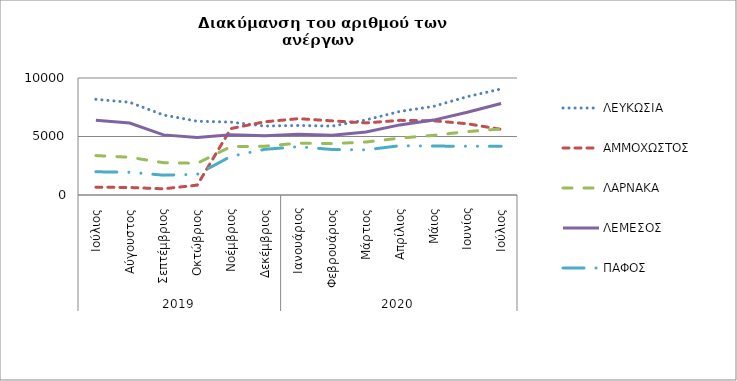
| Category | ΛΕΥΚΩΣΙΑ | ΑΜΜΟΧΩΣΤΟΣ | ΛΑΡΝΑΚΑ | ΛΕΜΕΣΟΣ | ΠΑΦΟΣ |
|---|---|---|---|---|---|
| 0 | 8179 | 668 | 3369 | 6382 | 1984 |
| 1 | 7922 | 641 | 3223 | 6153 | 1944 |
| 2 | 6840 | 529 | 2762 | 5139 | 1697 |
| 3 | 6306 | 843 | 2710 | 4922 | 1763 |
| 4 | 6231 | 5679 | 4139 | 5142 | 3304 |
| 5 | 5893 | 6256 | 4171 | 5061 | 3904 |
| 6 | 5943 | 6524 | 4433 | 5185 | 4129 |
| 7 | 5890 | 6335 | 4394 | 5114 | 3887 |
| 8 | 6416 | 6162 | 4527 | 5390 | 3858 |
| 9 | 7143 | 6380 | 4862 | 5992 | 4214 |
| 10 | 7576 | 6346 | 5099 | 6402 | 4181 |
| 11 | 8407 | 6088 | 5421 | 7072 | 4170 |
| 12 | 9066 | 5611 | 5646 | 7825 | 4165 |